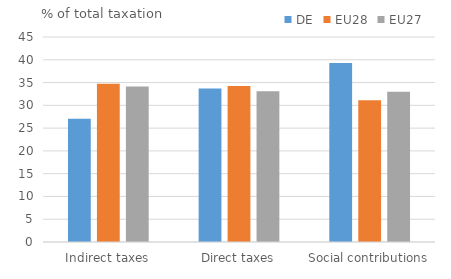
| Category | DE | EU28 | EU27 |
|---|---|---|---|
| Indirect taxes | 27.029 | 34.748 | 34.122 |
| Direct taxes | 33.689 | 34.27 | 33.09 |
| Social contributions | 39.282 | 31.135 | 32.964 |